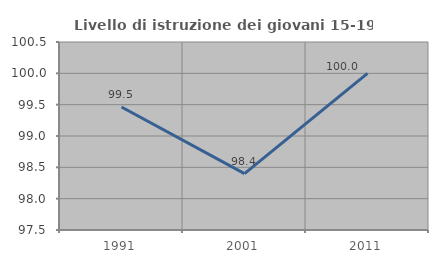
| Category | Livello di istruzione dei giovani 15-19 anni |
|---|---|
| 1991.0 | 99.462 |
| 2001.0 | 98.4 |
| 2011.0 | 100 |